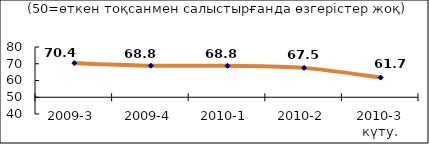
| Category | Диф.индекс ↓ |
|---|---|
| 2009-3 | 70.385 |
| 2009-4 | 68.825 |
| 2010-1 | 68.76 |
| 2010-2 | 67.535 |
| 2010-3 күту. | 61.735 |